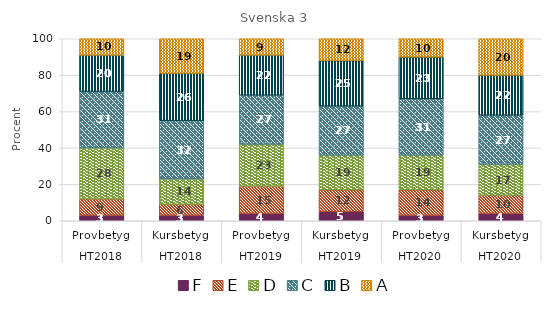
| Category | F | E | D | C | B | A |
|---|---|---|---|---|---|---|
| 0 | 3 | 9 | 28 | 31 | 20 | 10 |
| 1 | 3 | 6 | 14 | 32 | 26 | 19 |
| 2 | 4 | 15 | 23 | 27 | 22 | 9 |
| 3 | 5 | 12 | 19 | 27 | 25 | 12 |
| 4 | 3 | 14 | 19 | 31 | 23 | 10 |
| 5 | 4 | 10 | 17 | 27 | 22 | 20 |